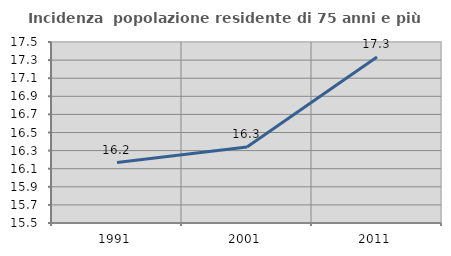
| Category | Incidenza  popolazione residente di 75 anni e più |
|---|---|
| 1991.0 | 16.168 |
| 2001.0 | 16.34 |
| 2011.0 | 17.333 |